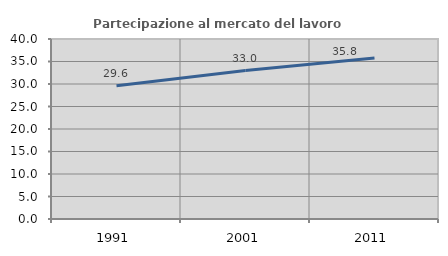
| Category | Partecipazione al mercato del lavoro  femminile |
|---|---|
| 1991.0 | 29.619 |
| 2001.0 | 32.98 |
| 2011.0 | 35.767 |